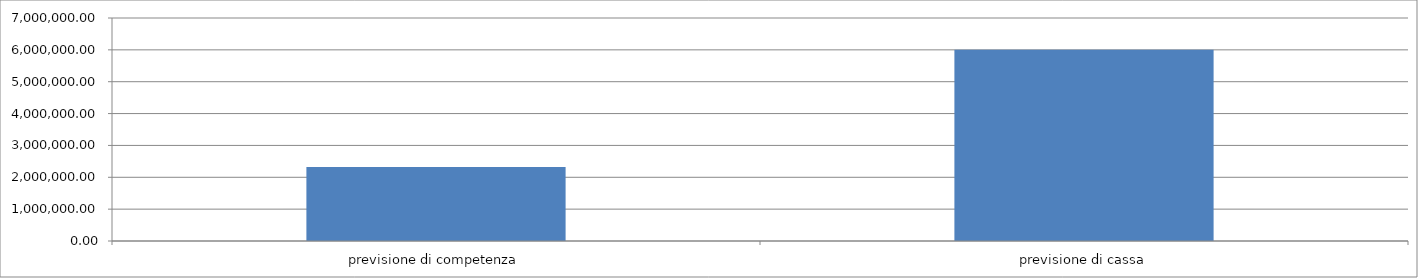
| Category | Series 0 |
|---|---|
| previsione di competenza | 2320000 |
| previsione di cassa | 6000000 |